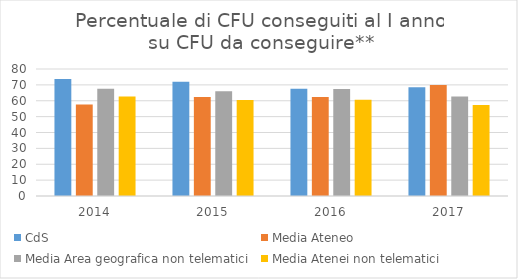
| Category | CdS | Media Ateneo | Media Area geografica non telematici | Media Atenei non telematici |
|---|---|---|---|---|
| 2014.0 | 73.7 | 57.7 | 67.6 | 62.7 |
| 2015.0 | 71.9 | 62.4 | 66 | 60.5 |
| 2016.0 | 67.5 | 62.3 | 67.4 | 60.6 |
| 2017.0 | 68.5 | 70 | 62.6 | 57.4 |